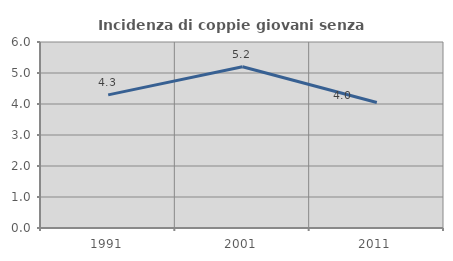
| Category | Incidenza di coppie giovani senza figli |
|---|---|
| 1991.0 | 4.294 |
| 2001.0 | 5.201 |
| 2011.0 | 4.049 |